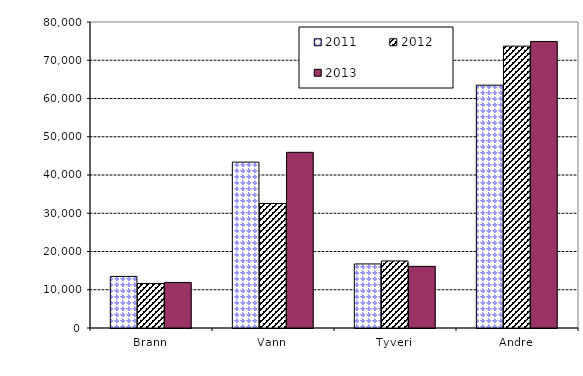
| Category | 2011 | 2012 | 2013 |
|---|---|---|---|
| Brann | 13483.327 | 11645 | 11909 |
| Vann | 43365.614 | 32547 | 45935 |
| Tyveri | 16749.587 | 17531 | 16113 |
| Andre | 63485.352 | 73691 | 74914 |